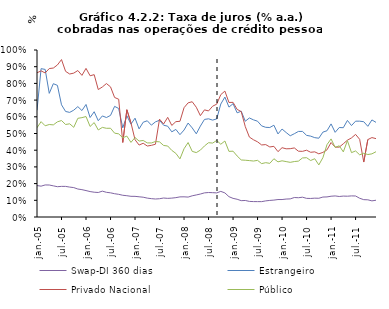
| Category | Swap-DI 360 dias | Estrangeiro | Privado Nacional | Público |
|---|---|---|---|---|
| 2005-01-01 | 0.188 | 0.639 | 0.863 | 0.534 |
| 2005-02-01 | 0.185 | 0.888 | 0.875 | 0.571 |
| 2005-03-01 | 0.192 | 0.884 | 0.863 | 0.546 |
| 2005-04-01 | 0.192 | 0.74 | 0.889 | 0.554 |
| 2005-05-01 | 0.186 | 0.798 | 0.892 | 0.552 |
| 2005-06-01 | 0.182 | 0.788 | 0.91 | 0.57 |
| 2005-07-01 | 0.183 | 0.672 | 0.943 | 0.578 |
| 2005-08-01 | 0.183 | 0.632 | 0.872 | 0.554 |
| 2005-09-01 | 0.179 | 0.626 | 0.856 | 0.558 |
| 2005-10-01 | 0.176 | 0.64 | 0.862 | 0.537 |
| 2005-11-01 | 0.168 | 0.661 | 0.877 | 0.591 |
| 2005-12-01 | 0.164 | 0.637 | 0.848 | 0.595 |
| 2006-01-01 | 0.158 | 0.674 | 0.89 | 0.602 |
| 2006-02-01 | 0.152 | 0.596 | 0.846 | 0.542 |
| 2006-03-01 | 0.148 | 0.63 | 0.852 | 0.565 |
| 2006-04-01 | 0.147 | 0.577 | 0.763 | 0.521 |
| 2006-05-01 | 0.155 | 0.605 | 0.779 | 0.536 |
| 2006-06-01 | 0.148 | 0.596 | 0.799 | 0.531 |
| 2006-07-01 | 0.145 | 0.608 | 0.779 | 0.531 |
| 2006-08-01 | 0.139 | 0.662 | 0.716 | 0.502 |
| 2006-09-01 | 0.136 | 0.65 | 0.705 | 0.498 |
| 2006-10-01 | 0.13 | 0.534 | 0.446 | 0.474 |
| 2006-11-01 | 0.128 | 0.607 | 0.642 | 0.484 |
| 2006-12-01 | 0.124 | 0.556 | 0.564 | 0.447 |
| 2007-01-01 | 0.124 | 0.592 | 0.463 | 0.476 |
| 2007-02-01 | 0.121 | 0.528 | 0.431 | 0.455 |
| 2007-03-01 | 0.118 | 0.568 | 0.442 | 0.458 |
| 2007-04-01 | 0.113 | 0.576 | 0.425 | 0.444 |
| 2007-05-01 | 0.11 | 0.55 | 0.429 | 0.443 |
| 2007-06-01 | 0.108 | 0.57 | 0.436 | 0.452 |
| 2007-07-01 | 0.109 | 0.579 | 0.586 | 0.45 |
| 2007-08-01 | 0.114 | 0.55 | 0.557 | 0.428 |
| 2007-09-01 | 0.112 | 0.544 | 0.597 | 0.425 |
| 2007-10-01 | 0.113 | 0.51 | 0.548 | 0.399 |
| 2007-11-01 | 0.116 | 0.524 | 0.571 | 0.381 |
| 2007-12-01 | 0.121 | 0.493 | 0.573 | 0.348 |
| 2008-01-01 | 0.121 | 0.521 | 0.654 | 0.409 |
| 2008-02-01 | 0.119 | 0.563 | 0.684 | 0.446 |
| 2008-03-01 | 0.127 | 0.533 | 0.69 | 0.393 |
| 2008-04-01 | 0.132 | 0.498 | 0.657 | 0.386 |
| 2008-05-01 | 0.138 | 0.544 | 0.607 | 0.4 |
| 2008-06-01 | 0.144 | 0.584 | 0.642 | 0.425 |
| 2008-07-01 | 0.147 | 0.588 | 0.635 | 0.445 |
| 2008-08-01 | 0.146 | 0.58 | 0.663 | 0.443 |
| 2008-09-01 | 0.144 | 0.587 | 0.676 | 0.458 |
| 2008-10-01 | 0.153 | 0.676 | 0.733 | 0.436 |
| 2008-11-01 | 0.144 | 0.718 | 0.754 | 0.455 |
| 2008-12-01 | 0.122 | 0.658 | 0.686 | 0.393 |
| 2009-01-01 | 0.112 | 0.678 | 0.687 | 0.394 |
| 2009-02-01 | 0.106 | 0.624 | 0.644 | 0.365 |
| 2009-03-01 | 0.098 | 0.633 | 0.631 | 0.342 |
| 2009-04-01 | 0.099 | 0.574 | 0.541 | 0.34 |
| 2009-05-01 | 0.093 | 0.593 | 0.479 | 0.338 |
| 2009-06-01 | 0.092 | 0.582 | 0.462 | 0.335 |
| 2009-07-01 | 0.092 | 0.574 | 0.45 | 0.339 |
| 2009-08-01 | 0.092 | 0.546 | 0.431 | 0.32 |
| 2009-09-01 | 0.096 | 0.537 | 0.433 | 0.325 |
| 2009-10-01 | 0.099 | 0.536 | 0.419 | 0.321 |
| 2009-11-01 | 0.101 | 0.55 | 0.423 | 0.349 |
| 2009-12-01 | 0.105 | 0.497 | 0.391 | 0.33 |
| 2010-01-01 | 0.105 | 0.527 | 0.415 | 0.337 |
| 2010-02-01 | 0.108 | 0.506 | 0.408 | 0.332 |
| 2010-03-01 | 0.108 | 0.486 | 0.409 | 0.327 |
| 2010-04-01 | 0.117 | 0.499 | 0.414 | 0.332 |
| 2010-05-01 | 0.115 | 0.512 | 0.394 | 0.334 |
| 2010-06-01 | 0.119 | 0.512 | 0.393 | 0.354 |
| 2010-07-01 | 0.112 | 0.489 | 0.4 | 0.355 |
| 2010-08-01 | 0.111 | 0.484 | 0.387 | 0.338 |
| 2010-09-01 | 0.113 | 0.475 | 0.39 | 0.349 |
| 2010-10-01 | 0.112 | 0.472 | 0.378 | 0.312 |
| 2010-11-01 | 0.119 | 0.508 | 0.387 | 0.355 |
| 2010-12-01 | 0.12 | 0.516 | 0.402 | 0.433 |
| 2011-01-01 | 0.124 | 0.557 | 0.446 | 0.468 |
| 2011-02-01 | 0.126 | 0.507 | 0.418 | 0.417 |
| 2011-03-01 | 0.123 | 0.536 | 0.418 | 0.426 |
| 2011-04-01 | 0.125 | 0.535 | 0.439 | 0.39 |
| 2011-05-01 | 0.124 | 0.578 | 0.46 | 0.457 |
| 2011-06-01 | 0.126 | 0.547 | 0.474 | 0.385 |
| 2011-07-01 | 0.126 | 0.574 | 0.495 | 0.396 |
| 2011-08-01 | 0.112 | 0.574 | 0.465 | 0.372 |
| 2011-09-01 | 0.104 | 0.571 | 0.329 | 0.382 |
| 2011-10-01 | 0.103 | 0.543 | 0.464 | 0.374 |
| 2011-11-01 | 0.097 | 0.581 | 0.475 | 0.378 |
| 2011-12-01 | 0.1 | 0.567 | 0.469 | 0.391 |